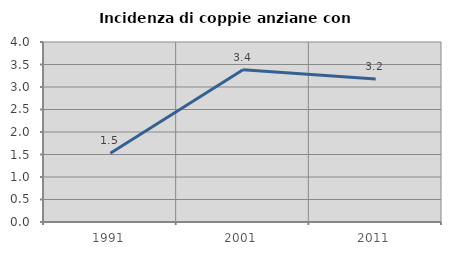
| Category | Incidenza di coppie anziane con figli |
|---|---|
| 1991.0 | 1.527 |
| 2001.0 | 3.385 |
| 2011.0 | 3.176 |